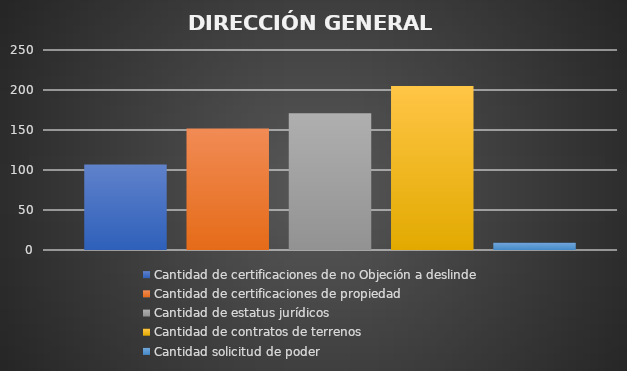
| Category | Cantidad de certificaciones de no Objeción a deslinde | Cantidad de certificaciones de propiedad | Cantidad de estatus jurídicos | Cantidad de contratos de terrenos | Cantidad solicitud de poder  |
|---|---|---|---|---|---|
| 0 | 107 | 152 | 171 | 205 | 9 |